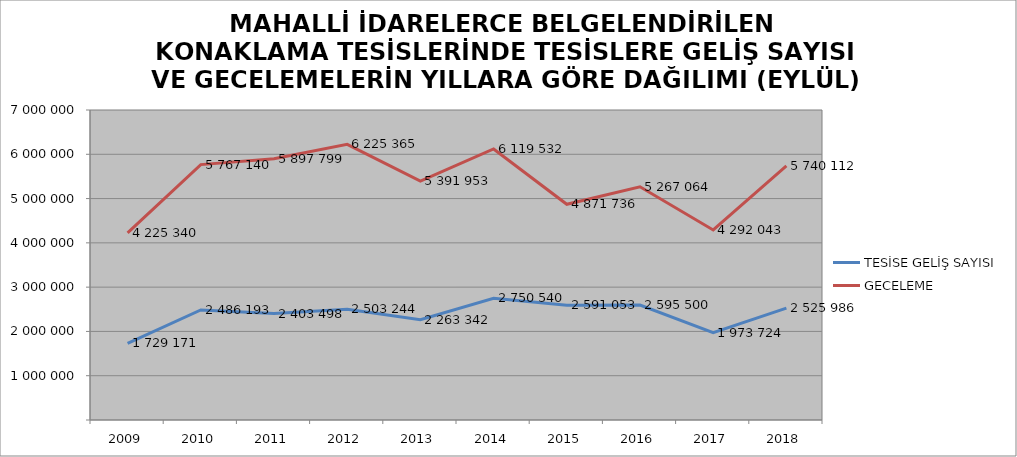
| Category | TESİSE GELİŞ SAYISI | GECELEME |
|---|---|---|
| 2009 | 1729171 | 4225340 |
| 2010 | 2486193 | 5767140 |
| 2011 | 2403498 | 5897799 |
| 2012 | 2503244 | 6225365 |
| 2013 | 2263342 | 5391953 |
| 2014 | 2750540 | 6119532 |
| 2015 | 2591053 | 4871736 |
| 2016 | 2595500 | 5267064 |
| 2017 | 1973724 | 4292043 |
| 2018 | 2525986 | 5740112 |